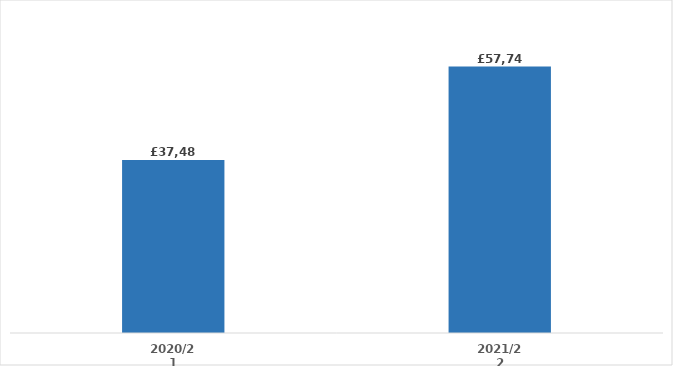
| Category | Series 0 |
|---|---|
| 2020/21 | 37489.11 |
| 2021/22 | 57741.195 |